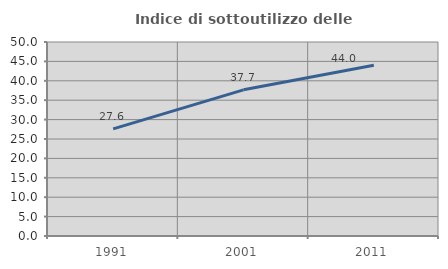
| Category | Indice di sottoutilizzo delle abitazioni  |
|---|---|
| 1991.0 | 27.617 |
| 2001.0 | 37.677 |
| 2011.0 | 43.996 |